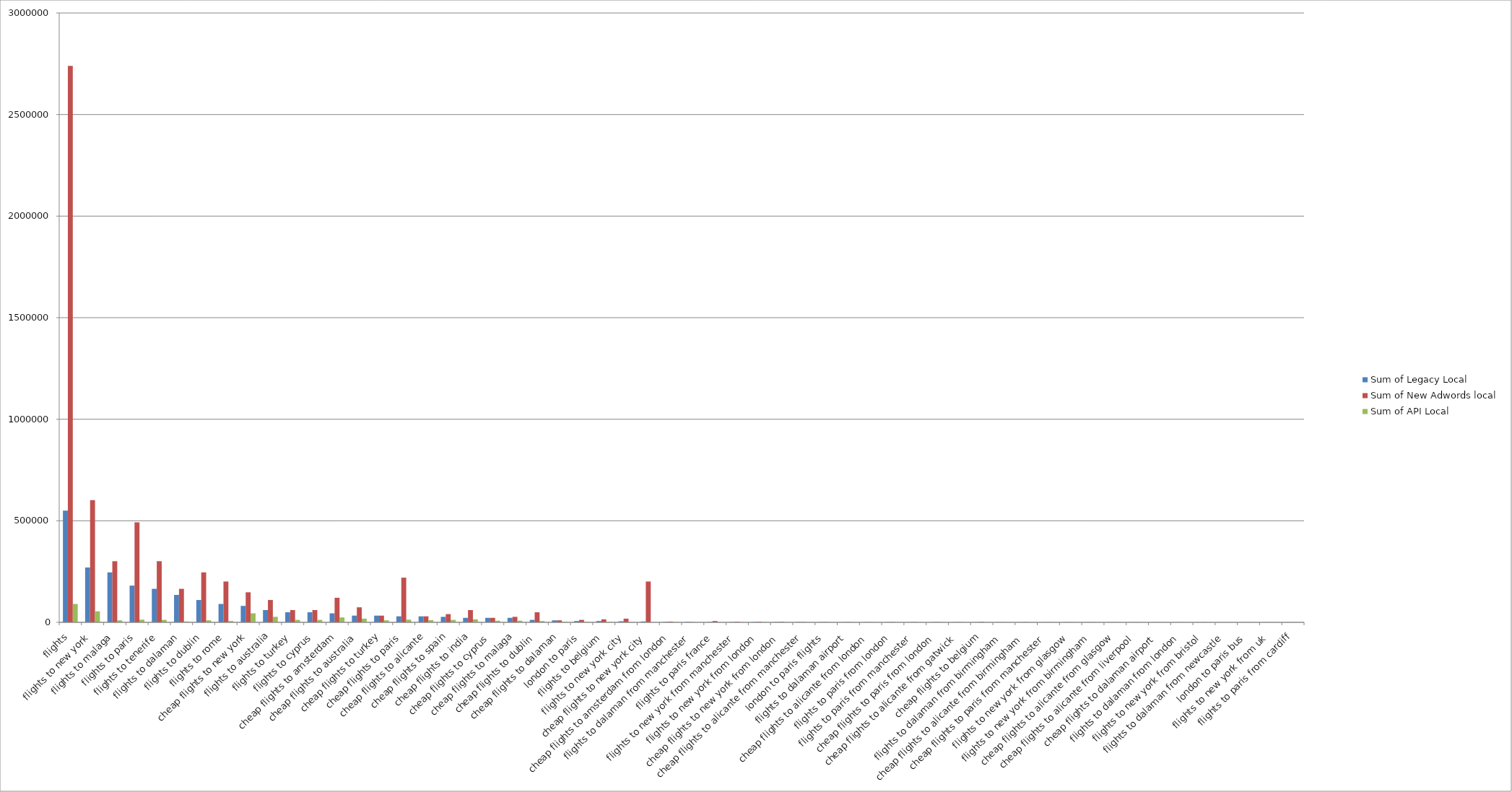
| Category | Sum of Legacy Local | Sum of New Adwords local | Sum of API Local |
|---|---|---|---|
| flights | 550000 | 2740000 | 90500 |
| flights to new york | 270000 | 602000 | 54200 |
| flights to malaga | 246000 | 301000 | 9900 |
| flights to paris | 181000 | 492000 | 13200 |
| flights to tenerife | 165000 | 301000 | 12100 |
| flights to dalaman | 135000 | 165000 | 4400 |
| flights to dublin | 110000 | 246000 | 9900 |
| flights to rome | 90500 | 201000 | 6600 |
| cheap flights to new york | 81000 | 148000 | 44400 |
| flights to australia | 60500 | 110000 | 27100 |
| flights to turkey | 49500 | 60500 | 12100 |
| flights to cyprus | 49500 | 60500 | 12100 |
| cheap flights to amsterdam | 44400 | 121000 | 24200 |
| cheap flights to australia | 33100 | 74000 | 18100 |
| cheap flights to turkey | 33100 | 33100 | 9900 |
| cheap flights to paris | 29600 | 220000 | 13200 |
| cheap flights to alicante | 29600 | 29600 | 10800 |
| cheap flights to spain | 27100 | 40500 | 12100 |
| cheap flights to india | 22200 | 60500 | 14800 |
| cheap flights to cyprus | 22200 | 22200 | 8100 |
| cheap flights to malaga | 22200 | 27100 | 8100 |
| cheap flights to dublin | 12100 | 49500 | 6600 |
| cheap flights to dalaman | 9900 | 9900 | 3600 |
| london to paris | 6600 | 12100 | 2900 |
| flights to belgium | 6600 | 14800 | 880 |
| flights to new york city | 5400 | 18100 | 880 |
| cheap flights to new york city | 4400 | 201000 | 390 |
| cheap flights to amsterdam from london | 2600 | 3800 | 1760 |
| flights to dalaman from manchester | 2400 | 1000 | 210 |
| flights to paris france | 1600 | 6600 | 260 |
| flights to new york from manchester | 1600 | 2900 | 1000 |
| flights to new york from london | 1600 | 2900 | 1000 |
| cheap flights to new york from london | 1600 | 2400 | 1000 |
| cheap flights to alicante from manchester | 1440 | 1440 | 520 |
| london to paris flights | 1000 | 1600 | 320 |
| flights to dalaman airport | 1000 | 1300 | 390 |
| cheap flights to alicante from london | 960 | 960 | 280 |
| flights to paris from london | 880 | 1600 | 590 |
| flights to paris from manchester | 880 | 1300 | 590 |
| cheap flights to paris from london | 880 | 1300 | 590 |
| cheap flights to alicante from gatwick | 780 | 1180 | 340 |
| cheap flights to belgium | 720 | 2400 | 260 |
| flights to dalaman from birmingham | 720 | 480 | 58 |
| cheap flights to alicante from birmingham | 640 | 960 | 340 |
| cheap flights to paris from manchester | 590 | 720 | 320 |
| flights to new york from glasgow | 590 | 880 | 320 |
| flights to new york from birmingham | 480 | 880 | 320 |
| cheap flights to alicante from glasgow | 420 | 420 | 146 |
| cheap flights to alicante from liverpool | 420 | 520 | 182 |
| cheap flights to dalaman airport | 390 | 590 | 320 |
| flights to dalaman from london | 320 | 390 | 110 |
| flights to new york from bristol | 320 | 480 | 170 |
| flights to dalaman from newcastle | 210 | 210 | 58 |
| london to paris bus | 210 | 480 | 91 |
| flights to new york from uk | 210 | 390 | 91 |
| flights to paris from cardiff | 210 | 260 | 110 |